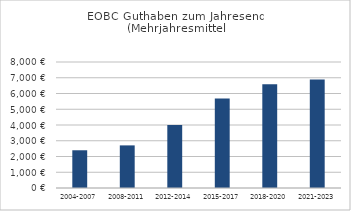
| Category |  Guthaben  |
|---|---|
| 2004-2007 | 2396 |
| 2008-2011 | 2705.5 |
| 2012-2014 | 4000.667 |
| 2015-2017 | 5679.367 |
| 2018-2020 | 6589.223 |
| 2021-2023 | 6882 |